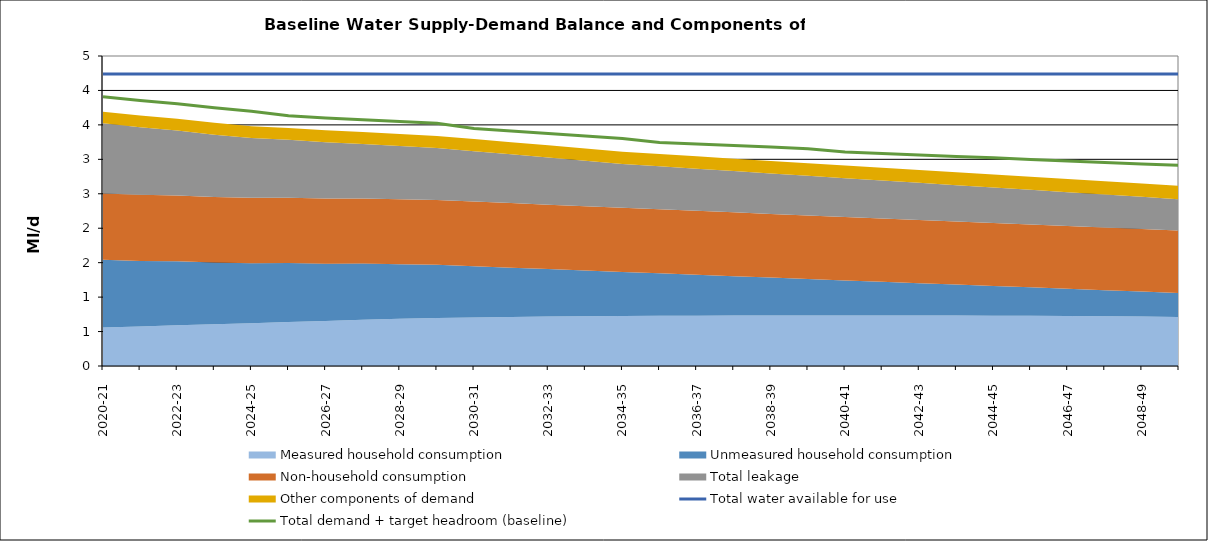
| Category | Total water available for use | Total demand + target headroom (baseline) |
|---|---|---|
| 2020-21 | 4.238 | 3.908 |
| 2021-22 | 4.238 | 3.854 |
| 2022-23 | 4.238 | 3.808 |
| 2023-24 | 4.238 | 3.749 |
| 2024-25 | 4.238 | 3.699 |
| 2025-26 | 4.238 | 3.632 |
| 2026-27 | 4.238 | 3.599 |
| 2027-28 | 4.238 | 3.575 |
| 2028-29 | 4.238 | 3.548 |
| 2029-30 | 4.238 | 3.523 |
| 2030-31 | 4.238 | 3.447 |
| 2031-32 | 4.238 | 3.41 |
| 2032-33 | 4.238 | 3.374 |
| 2033-34 | 4.238 | 3.339 |
| 2034-35 | 4.238 | 3.302 |
| 2035-36 | 4.238 | 3.244 |
| 2036-37 | 4.238 | 3.224 |
| 2037-38 | 4.238 | 3.202 |
| 2038-39 | 4.238 | 3.18 |
| 2039-40 | 4.238 | 3.155 |
| 2040-41 | 4.238 | 3.106 |
| 2041-42 | 4.238 | 3.084 |
| 2042-43 | 4.238 | 3.061 |
| 2043-44 | 4.238 | 3.041 |
| 2044-45 | 4.238 | 3.023 |
| 2045-46 | 4.238 | 2.997 |
| 2046-47 | 4.238 | 2.976 |
| 2047-48 | 4.238 | 2.955 |
| 2048-49 | 4.238 | 2.934 |
| 2049-50 | 4.238 | 2.913 |